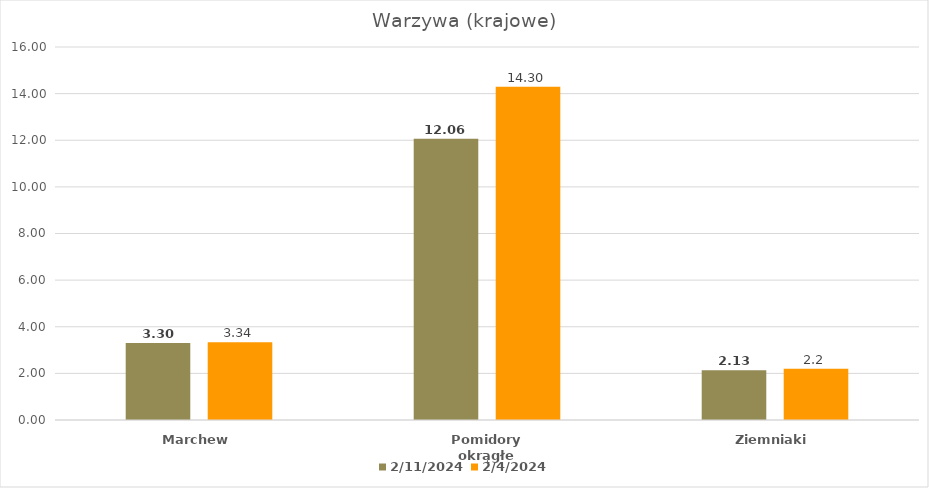
| Category | 11.02.2024 | 04.02.2024 |
|---|---|---|
| Marchew | 3.3 | 3.34 |
| Pomidory okrągłe | 12.06 | 14.3 |
| Ziemniaki | 2.13 | 2.2 |